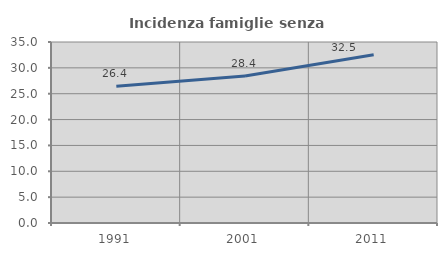
| Category | Incidenza famiglie senza nuclei |
|---|---|
| 1991.0 | 26.446 |
| 2001.0 | 28.416 |
| 2011.0 | 32.516 |